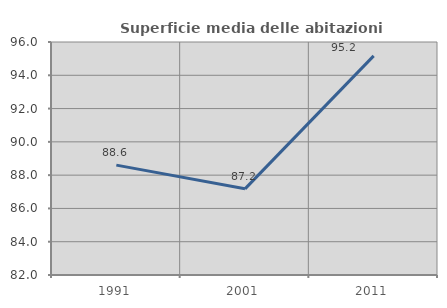
| Category | Superficie media delle abitazioni occupate |
|---|---|
| 1991.0 | 88.602 |
| 2001.0 | 87.177 |
| 2011.0 | 95.165 |